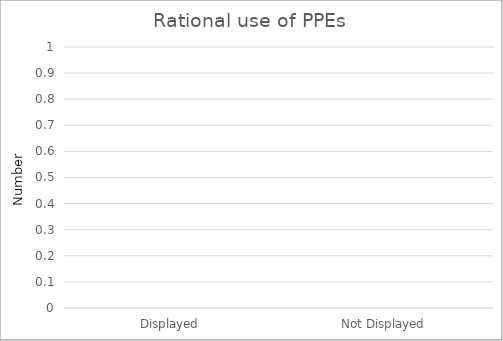
| Category | Rational use of PPEs |
|---|---|
| Displayed | 0 |
| Not Displayed | 0 |